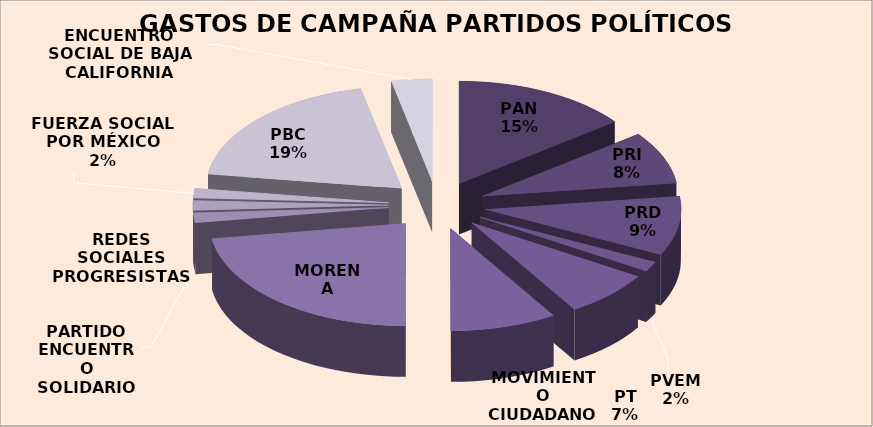
| Category | MONTO |
|---|---|
| PAN | 7088762.96 |
| PRI | 4009559.44 |
| PRD | 4519851.11 |
| PVEM | 750080.48 |
| PT | 3556285.7 |
| MOVIMIENTO CIUDADANO | 4251015.32 |
| MORENA | 10947799.61 |
| PARTIDO ENCUENTRO SOLIDARIO | 750080.48 |
| REDES SOCIALES PROGRESISTAS | 750080.48 |
| FUERZA SOCIAL POR MÉXICO | 750080.48 |
| PBC | 9376005.98 |
| ENCUENTRO SOCIAL DE BAJA CALIFORNIA | 1625174.37 |